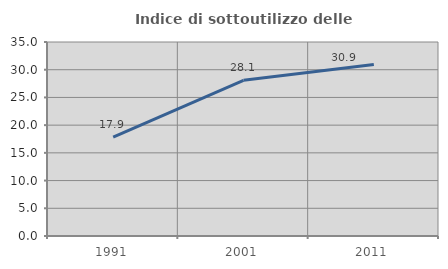
| Category | Indice di sottoutilizzo delle abitazioni  |
|---|---|
| 1991.0 | 17.857 |
| 2001.0 | 28.099 |
| 2011.0 | 30.939 |